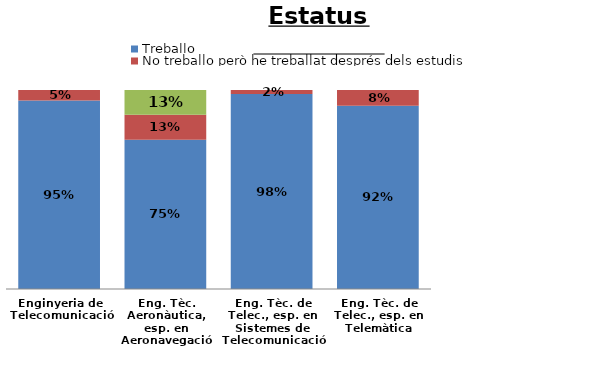
| Category | Treballo | No treballo però he treballat després dels estudis | No he treballat mai |
|---|---|---|---|
| Enginyeria de Telecomunicació | 0.947 | 0.053 | 0 |
| Eng. Tèc. Aeronàutica, esp. en Aeronavegació | 0.75 | 0.125 | 0.125 |
| Eng. Tèc. de Telec., esp. en Sistemes de Telecomunicació | 0.979 | 0.021 | 0 |
| Eng. Tèc. de Telec., esp. en Telemàtica | 0.92 | 0.08 | 0 |